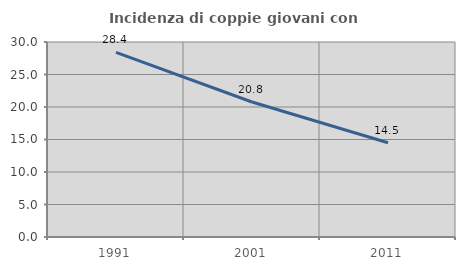
| Category | Incidenza di coppie giovani con figli |
|---|---|
| 1991.0 | 28.394 |
| 2001.0 | 20.774 |
| 2011.0 | 14.502 |